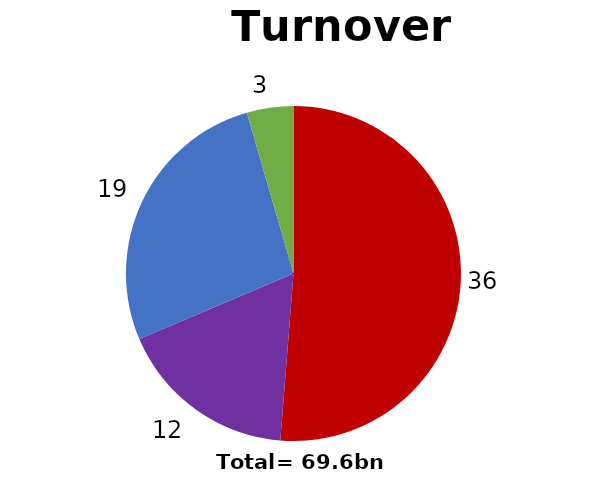
| Category | Series 0 |
|---|---|
| Biopharma core | 35.674 |
| Biopharma Service & Supply | 12.073 |
| Med Tech core | 18.726 |
| Med Tech Service & supply | 3.128 |